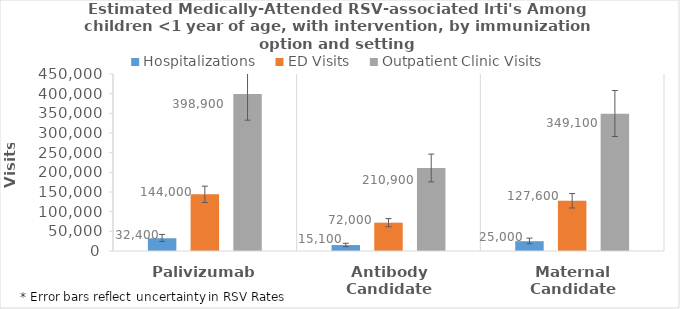
| Category | Hospitalizations | ED Visits | Outpatient Clinic Visits |
|---|---|---|---|
| Palivizumab | 32400 | 144000 | 398900 |
| Antibody Candidate | 15100 | 72000 | 210900 |
| Maternal Candidate | 25000 | 127600 | 349100 |